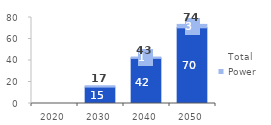
| Category | Final | Power | Total |
|---|---|---|---|
| 2020.0 | 0 | 0 | 0 |
| 2030.0 | 15.248 | 1.274 | 16.522 |
| 2040.0 | 41.978 | 1.248 | 43.226 |
| 2050.0 | 70.39 | 3.198 | 73.588 |